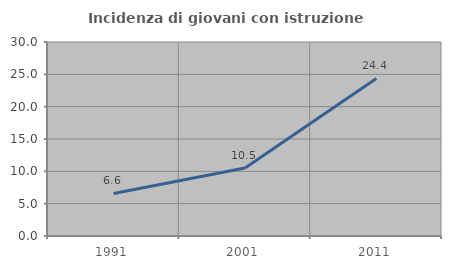
| Category | Incidenza di giovani con istruzione universitaria |
|---|---|
| 1991.0 | 6.584 |
| 2001.0 | 10.526 |
| 2011.0 | 24.365 |